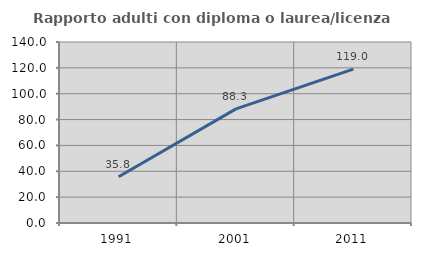
| Category | Rapporto adulti con diploma o laurea/licenza media  |
|---|---|
| 1991.0 | 35.827 |
| 2001.0 | 88.298 |
| 2011.0 | 119.048 |